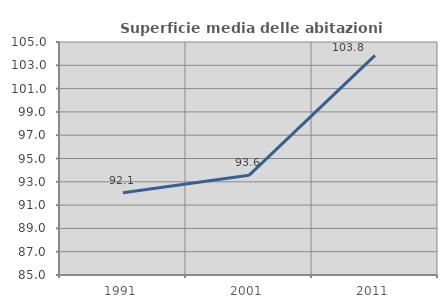
| Category | Superficie media delle abitazioni occupate |
|---|---|
| 1991.0 | 92.064 |
| 2001.0 | 93.553 |
| 2011.0 | 103.847 |